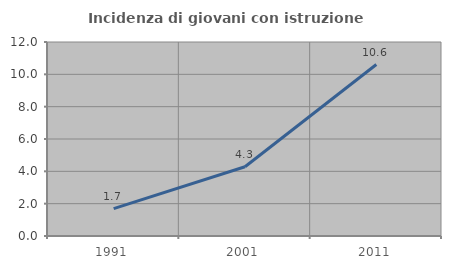
| Category | Incidenza di giovani con istruzione universitaria |
|---|---|
| 1991.0 | 1.695 |
| 2001.0 | 4.286 |
| 2011.0 | 10.606 |